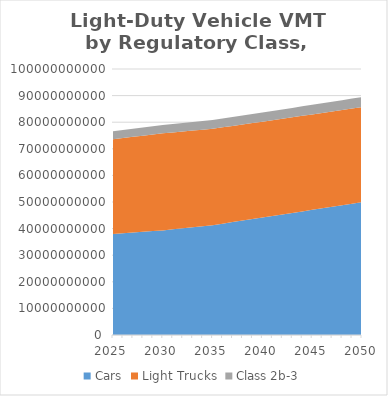
| Category | Cars | Light Trucks | Class 2b-3 |
|---|---|---|---|
| 2025.0 | 38012720142.525 | 35609724748.966 | 2974451108.308 |
| 2026.0 | 38274223107.402 | 35787432736.025 | 3005044821.846 |
| 2027.0 | 38535726072.279 | 35965140723.083 | 3035638535.385 |
| 2028.0 | 38797229037.156 | 36142848710.141 | 3066232248.923 |
| 2029.0 | 39058732002.033 | 36320556697.2 | 3096825962.462 |
| 2030.0 | 39320234966.91 | 36498264684.258 | 3127419676 |
| 2031.0 | 39716102938.311 | 36446900833.638 | 3156830036.655 |
| 2032.0 | 40111970909.712 | 36395536983.018 | 3186240397.311 |
| 2033.0 | 40507838881.113 | 36344173132.398 | 3215650757.966 |
| 2034.0 | 40903706852.514 | 36292809281.778 | 3245061118.622 |
| 2035.0 | 41299574823.915 | 36241445431.158 | 3274471479.277 |
| 2036.0 | 41867353577.652 | 36202657917.941 | 3304087915.422 |
| 2037.0 | 42435132331.39 | 36163870404.724 | 3333704351.566 |
| 2038.0 | 43002911085.127 | 36125082891.507 | 3363320787.711 |
| 2039.0 | 43570689838.865 | 36086295378.29 | 3392937223.855 |
| 2040.0 | 44138468592.602 | 36047507865.072 | 3422553660 |
| 2041.0 | 44719452970.044 | 36016592932.168 | 3458278868.11 |
| 2042.0 | 45300437347.486 | 35985677999.263 | 3494004076.221 |
| 2043.0 | 45881421724.928 | 35954763066.359 | 3529729284.331 |
| 2044.0 | 46462406102.369 | 35923848133.454 | 3565454492.442 |
| 2045.0 | 47043390479.811 | 35892933200.549 | 3601179700.552 |
| 2046.0 | 47624374857.253 | 35862018267.645 | 3636904908.663 |
| 2047.0 | 48205359234.695 | 35831103334.74 | 3672630116.773 |
| 2048.0 | 48786343612.137 | 35800188401.836 | 3708355324.884 |
| 2049.0 | 49367327989.579 | 35769273468.931 | 3744080532.994 |
| 2050.0 | 49948312367.02 | 35738358536.026 | 3779805741.105 |